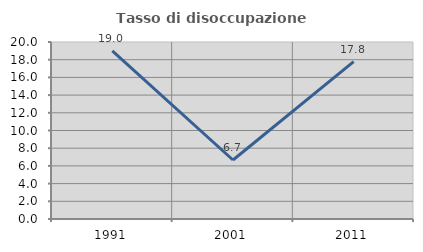
| Category | Tasso di disoccupazione giovanile  |
|---|---|
| 1991.0 | 18.987 |
| 2001.0 | 6.667 |
| 2011.0 | 17.778 |